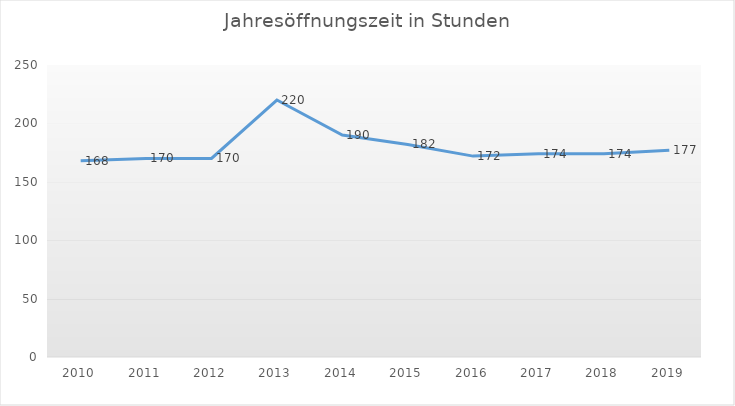
| Category | Jahresöffnungszeit in Stunden |
|---|---|
| 2010.0 | 168 |
| 2011.0 | 170 |
| 2012.0 | 170 |
| 2013.0 | 220 |
| 2014.0 | 190 |
| 2015.0 | 182 |
| 2016.0 | 172 |
| 2017.0 | 174 |
| 2018.0 | 174 |
| 2019.0 | 177 |